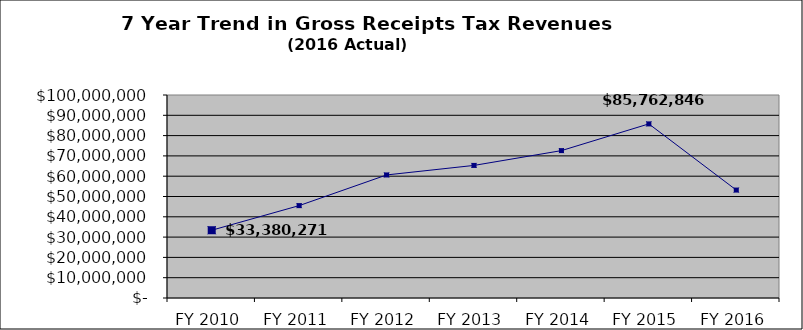
| Category | Series 0 | FY 2010 FY 2011 FY 2012 FY 2013 FY 2014 |
|---|---|---|
| FY 2010 | 33380270.668 |  |
| FY 2011 | 45507711.857 |  |
| FY 2012 | 60618813.725 |  |
| FY 2013 | 65310148.758 |  |
| FY 2014 | 72600731.593 |  |
| FY 2015 | 85762845.637 |  |
| FY 2016 | 53169122.602 |  |